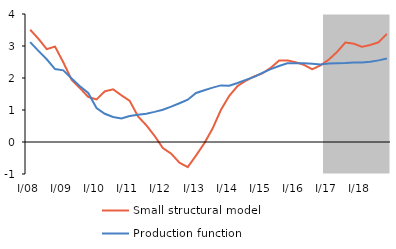
| Category | Small structural model | Production function |
|---|---|---|
| I/08 | 3.51 | 3.12 |
| II | 3.225 | 2.848 |
| III | 2.902 | 2.586 |
| IV | 2.983 | 2.28 |
| I/09 | 2.486 | 2.239 |
| II | 1.945 | 1.986 |
| III | 1.685 | 1.744 |
| IV | 1.408 | 1.533 |
| I/10 | 1.33 | 1.062 |
| II | 1.584 | 0.881 |
| III | 1.646 | 0.78 |
| IV | 1.46 | 0.735 |
| I/11 | 1.286 | 0.814 |
| II | 0.801 | 0.853 |
| III | 0.524 | 0.882 |
| IV | 0.191 | 0.941 |
| I/12 | -0.19 | 1.006 |
| II | -0.364 | 1.105 |
| III | -0.647 | 1.212 |
| IV | -0.784 | 1.323 |
| I/13 | -0.421 | 1.532 |
| II | -0.039 | 1.618 |
| III | 0.425 | 1.699 |
| IV | 1.007 | 1.769 |
| I/14 | 1.441 | 1.757 |
| II | 1.749 | 1.844 |
| III | 1.916 | 1.941 |
| IV | 2.048 | 2.033 |
| I/15 | 2.147 | 2.163 |
| II | 2.317 | 2.275 |
| III | 2.543 | 2.374 |
| IV | 2.551 | 2.461 |
| I/16 | 2.494 | 2.464 |
| II | 2.411 | 2.46 |
| III | 2.273 | 2.448 |
| IV | 2.394 | 2.423 |
| I/17 | 2.574 | 2.454 |
| II | 2.815 | 2.463 |
| III | 3.11 | 2.466 |
| IV | 3.073 | 2.484 |
| I/18 | 2.974 | 2.487 |
| II | 3.031 | 2.511 |
| III | 3.116 | 2.551 |
| IV | 3.377 | 2.607 |